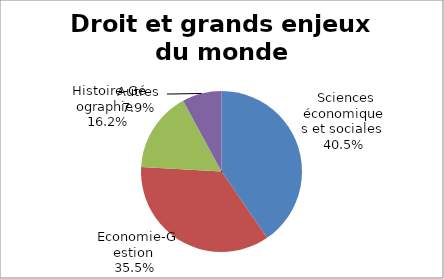
| Category | Droit et grands enjeux du monde contemporain |
|---|---|
| Sciences économiques et sociales | 0.404 |
| Economie-Gestion | 0.355 |
| Histoire-Géographie | 0.162 |
| Autres | 0.079 |